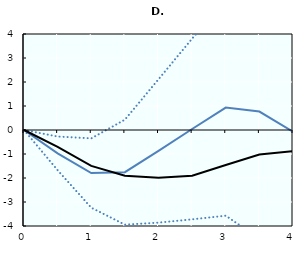
| Category | Effect during bust | confidence lower | confidence upper | Average effect |
|---|---|---|---|---|
| 0.0 | 0 | 0 | 0 | 0 |
| nan | -0.974 | -1.677 | -0.272 | -0.705 |
| 1.0 | -1.793 | -3.237 | -0.348 | -1.494 |
| nan | -1.757 | -3.943 | 0.429 | -1.907 |
| 2.0 | -0.874 | -3.86 | 2.113 | -1.987 |
| nan | 0.043 | -3.722 | 3.808 | -1.904 |
| 3.0 | 0.933 | -3.571 | 5.438 | -1.459 |
| nan | 0.769 | -4.522 | 6.061 | -1.023 |
| 4.0 | -0.071 | -6.371 | 6.229 | -0.883 |